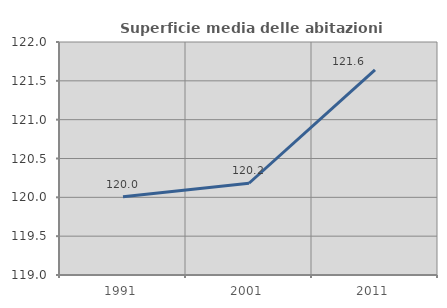
| Category | Superficie media delle abitazioni occupate |
|---|---|
| 1991.0 | 120.007 |
| 2001.0 | 120.181 |
| 2011.0 | 121.642 |